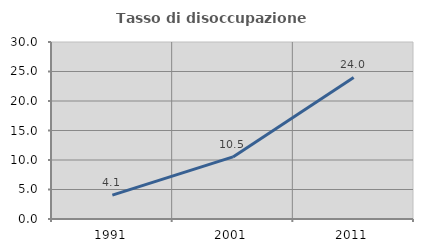
| Category | Tasso di disoccupazione giovanile  |
|---|---|
| 1991.0 | 4.054 |
| 2001.0 | 10.526 |
| 2011.0 | 24 |